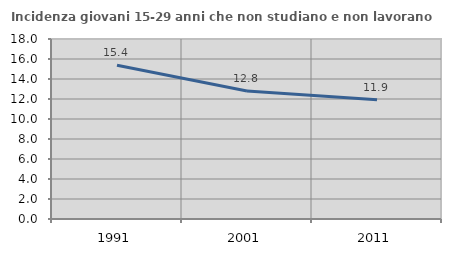
| Category | Incidenza giovani 15-29 anni che non studiano e non lavorano  |
|---|---|
| 1991.0 | 15.385 |
| 2001.0 | 12.808 |
| 2011.0 | 11.918 |